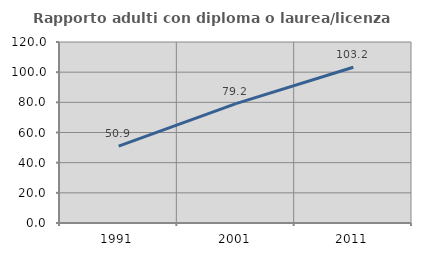
| Category | Rapporto adulti con diploma o laurea/licenza media  |
|---|---|
| 1991.0 | 50.912 |
| 2001.0 | 79.167 |
| 2011.0 | 103.233 |